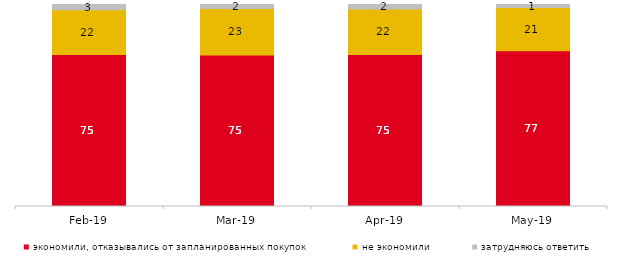
| Category | экономили, отказывались от запланированных покупок | не экономили | затрудняюсь ответить |
|---|---|---|---|
| 2019-02-01 | 75.2 | 22.2 | 2.6 |
| 2019-03-01 | 75.037 | 23.023 | 1.939 |
| 2019-04-01 | 75.297 | 22.426 | 2.277 |
| 2019-05-01 | 77.068 | 21.496 | 1.436 |